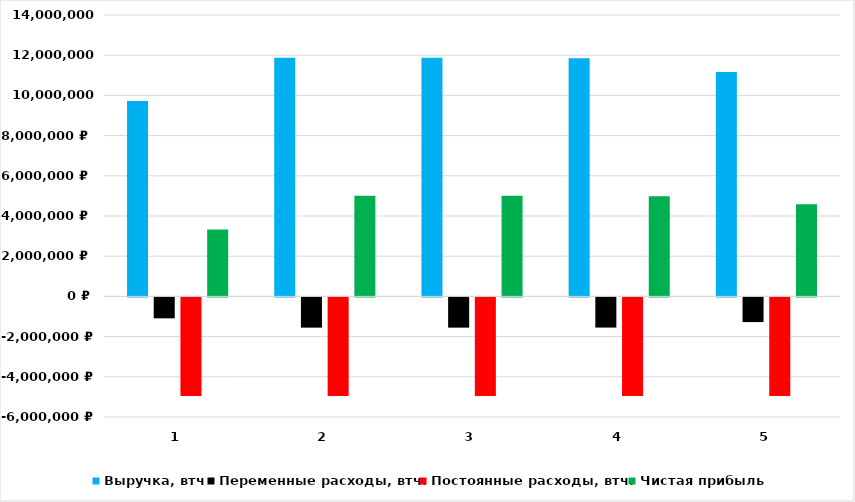
| Category | Выручка, втч | Переменные расходы, втч: | Постоянные расходы, втч: | Чистая прибыль |
|---|---|---|---|---|
| 0 | 9724860 | -1041337.8 | -4909291.034 | 3330518.206 |
| 1 | 11876544 | -1504362.24 | -4911291.034 | 5005652.006 |
| 2 | 11876544 | -1504362.24 | -4911291.034 | 5005652.006 |
| 3 | 11851488 | -1501188.48 | -4911291.034 | 4983519.206 |
| 4 | 11165580 | -1228213.8 | -4911291.034 | 4581046.766 |